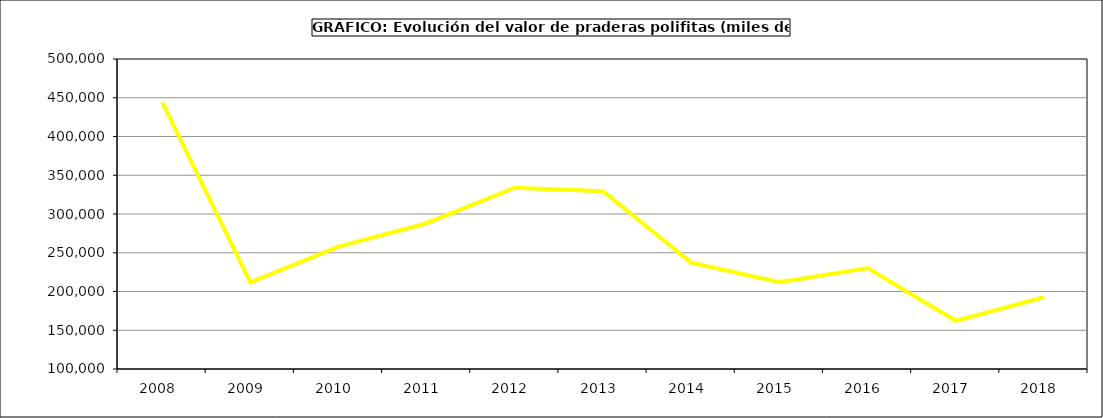
| Category | Valor |
|---|---|
| 2008.0 | 444361.431 |
| 2009.0 | 211697.199 |
| 2010.0 | 257899.036 |
| 2011.0 | 288090.963 |
| 2012.0 | 333939.944 |
| 2013.0 | 329402.741 |
| 2014.0 | 237285.995 |
| 2015.0 | 212093 |
| 2016.0 | 230171 |
| 2017.0 | 162246.482 |
| 2018.0 | 192621.026 |